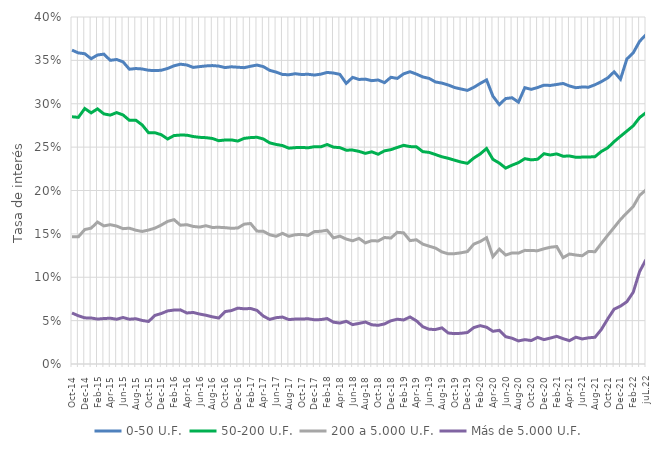
| Category | 0-50 U.F. | 50-200 U.F. | 200 a 5.000 U.F. | Más de 5.000 U.F. |
|---|---|---|---|---|
| oct-14 | 0.362 | 0.285 | 0.147 | 0.059 |
| nov-14 | 0.359 | 0.284 | 0.147 | 0.056 |
| dic-14 | 0.358 | 0.294 | 0.155 | 0.053 |
| ene-15 | 0.352 | 0.29 | 0.157 | 0.053 |
| feb-15 | 0.356 | 0.294 | 0.164 | 0.052 |
| mar-15 | 0.357 | 0.288 | 0.159 | 0.052 |
| abr-15 | 0.35 | 0.287 | 0.161 | 0.053 |
| may-15 | 0.351 | 0.29 | 0.159 | 0.052 |
| jun-15 | 0.348 | 0.287 | 0.156 | 0.054 |
| jul-15 | 0.34 | 0.281 | 0.157 | 0.052 |
| ago-15 | 0.341 | 0.281 | 0.154 | 0.052 |
| sept-15 | 0.34 | 0.276 | 0.153 | 0.05 |
| oct-15 | 0.339 | 0.267 | 0.154 | 0.049 |
| nov-15 | 0.338 | 0.267 | 0.157 | 0.056 |
| dic-15 | 0.339 | 0.264 | 0.16 | 0.058 |
| ene-16 | 0.341 | 0.259 | 0.164 | 0.061 |
| feb-16 | 0.344 | 0.263 | 0.166 | 0.062 |
| mar-16 | 0.346 | 0.264 | 0.16 | 0.062 |
| abr-16 | 0.345 | 0.264 | 0.161 | 0.059 |
| may-16 | 0.342 | 0.262 | 0.159 | 0.059 |
| jun-16 | 0.343 | 0.261 | 0.158 | 0.058 |
| jul-16 | 0.344 | 0.261 | 0.159 | 0.056 |
| ago-16 | 0.344 | 0.26 | 0.157 | 0.054 |
| sept-16 | 0.343 | 0.257 | 0.158 | 0.053 |
| oct-16 | 0.342 | 0.258 | 0.157 | 0.06 |
| nov-16 | 0.343 | 0.258 | 0.156 | 0.062 |
| dic-16 | 0.342 | 0.257 | 0.157 | 0.064 |
| ene-17 | 0.342 | 0.26 | 0.161 | 0.064 |
| feb-17 | 0.343 | 0.261 | 0.162 | 0.064 |
| mar-17 | 0.345 | 0.261 | 0.153 | 0.062 |
| abr-17 | 0.343 | 0.259 | 0.153 | 0.055 |
| may-17 | 0.338 | 0.255 | 0.149 | 0.051 |
| jun-17 | 0.336 | 0.253 | 0.147 | 0.053 |
| jul-17 | 0.334 | 0.252 | 0.151 | 0.054 |
| ago-17 | 0.333 | 0.249 | 0.147 | 0.051 |
| sept-17 | 0.335 | 0.249 | 0.149 | 0.052 |
| oct-17 | 0.334 | 0.25 | 0.149 | 0.052 |
| nov-17 | 0.334 | 0.249 | 0.148 | 0.052 |
| dic-17 | 0.333 | 0.25 | 0.153 | 0.051 |
| ene-18 | 0.334 | 0.25 | 0.153 | 0.051 |
| feb-18 | 0.336 | 0.253 | 0.154 | 0.052 |
| mar-18 | 0.335 | 0.25 | 0.145 | 0.048 |
| abr-18 | 0.334 | 0.249 | 0.147 | 0.047 |
| may-18 | 0.324 | 0.246 | 0.144 | 0.049 |
| jun-18 | 0.33 | 0.247 | 0.142 | 0.045 |
| jul-18 | 0.328 | 0.245 | 0.145 | 0.047 |
| ago-18 | 0.328 | 0.243 | 0.14 | 0.048 |
| sept-18 | 0.327 | 0.245 | 0.142 | 0.045 |
| oct-18 | 0.327 | 0.242 | 0.142 | 0.045 |
| nov-18 | 0.324 | 0.246 | 0.146 | 0.046 |
| dic-18 | 0.33 | 0.247 | 0.145 | 0.05 |
| ene-19 | 0.329 | 0.25 | 0.152 | 0.052 |
| feb-19 | 0.334 | 0.252 | 0.151 | 0.051 |
| mar-19 | 0.337 | 0.251 | 0.142 | 0.054 |
| abr-19 | 0.334 | 0.25 | 0.143 | 0.05 |
| may-19 | 0.331 | 0.245 | 0.138 | 0.043 |
| jun-19 | 0.329 | 0.244 | 0.136 | 0.04 |
| jul-19 | 0.325 | 0.241 | 0.134 | 0.04 |
| ago-19 | 0.324 | 0.239 | 0.129 | 0.042 |
| sept-19 | 0.322 | 0.237 | 0.127 | 0.036 |
| oct-19 | 0.319 | 0.235 | 0.127 | 0.035 |
| nov-19 | 0.317 | 0.233 | 0.128 | 0.035 |
| dic-19 | 0.315 | 0.231 | 0.13 | 0.036 |
| ene-20 | 0.319 | 0.237 | 0.138 | 0.042 |
| feb-20 | 0.323 | 0.242 | 0.141 | 0.044 |
| mar-20 | 0.328 | 0.248 | 0.146 | 0.042 |
| abr-20 | 0.309 | 0.236 | 0.124 | 0.038 |
| may-20 | 0.299 | 0.232 | 0.132 | 0.039 |
| jun-20 | 0.306 | 0.226 | 0.126 | 0.032 |
| jul-20 | 0.307 | 0.229 | 0.128 | 0.03 |
| ago-20 | 0.302 | 0.232 | 0.128 | 0.027 |
| sept-20 | 0.318 | 0.237 | 0.131 | 0.028 |
| oct-20 | 0.317 | 0.235 | 0.131 | 0.027 |
| nov-20 | 0.319 | 0.236 | 0.131 | 0.031 |
| dic-20 | 0.321 | 0.242 | 0.133 | 0.028 |
| ene-21 | 0.321 | 0.241 | 0.135 | 0.03 |
| feb-21 | 0.322 | 0.242 | 0.135 | 0.032 |
| mar-21 | 0.323 | 0.24 | 0.123 | 0.029 |
| abr-21 | 0.32 | 0.24 | 0.127 | 0.027 |
| may-21 | 0.318 | 0.238 | 0.126 | 0.031 |
| jun-21 | 0.319 | 0.238 | 0.125 | 0.029 |
| jul-21 | 0.319 | 0.239 | 0.13 | 0.03 |
| ago-21 | 0.322 | 0.239 | 0.129 | 0.031 |
| sept-21 | 0.326 | 0.245 | 0.139 | 0.04 |
| oct-21 | 0.33 | 0.249 | 0.148 | 0.052 |
| nov-21 | 0.337 | 0.256 | 0.157 | 0.063 |
| dic-21 | 0.328 | 0.262 | 0.167 | 0.067 |
| ene.22 | 0.352 | 0.268 | 0.174 | 0.072 |
| feb-22 | 0.359 | 0.275 | 0.182 | 0.083 |
| may.22 | 0.372 | 0.284 | 0.194 | 0.107 |
| juL.22 | 0.38 | 0.29 | 0.201 | 0.12 |